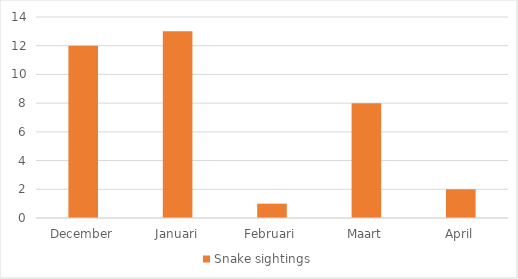
| Category | Snake sightings |
|---|---|
| December | 12 |
| Januari | 13 |
| Februari | 1 |
| Maart | 8 |
| April | 2 |